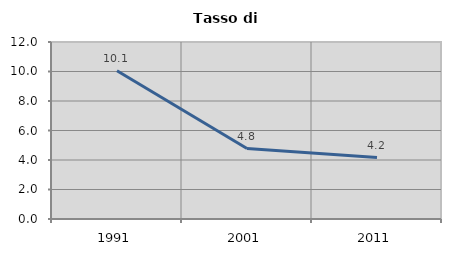
| Category | Tasso di disoccupazione   |
|---|---|
| 1991.0 | 10.051 |
| 2001.0 | 4.774 |
| 2011.0 | 4.164 |